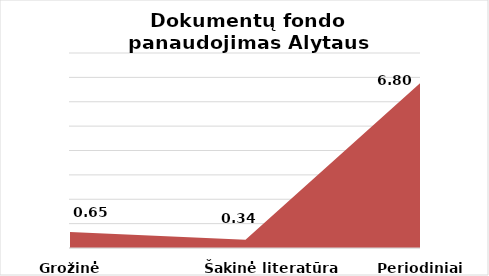
| Category | Series 0 |
|---|---|
| Grožinė literatūra | 0.654 |
| Šakinė literatūra | 0.337 |
| Periodiniai leidiniai | 6.797 |